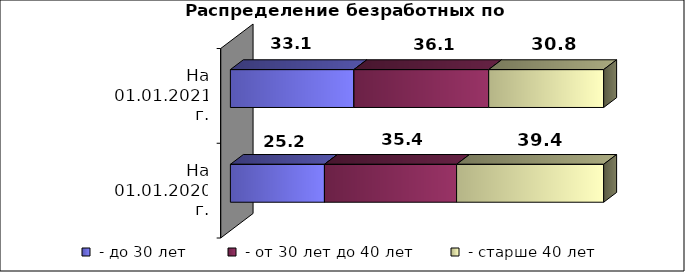
| Category |  - до 30 лет  |  - от 30 лет до 40 лет  |  - старше 40 лет  |
|---|---|---|---|
| На 01.01.2020 г. | 25.2 | 35.4 | 39.4 |
| На 01.01.2021 г. | 33.1 | 36.1 | 30.8 |